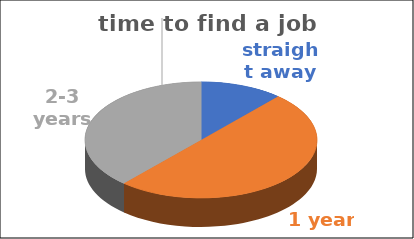
| Category | time to find a job | Series 1 | Series 2 | Series 3 | Series 4 |
|---|---|---|---|---|---|
| straight away | 0.12 |  |  |  |  |
| 1 year | 0.52 |  |  |  |  |
| 2-3 years | 0.4 |  |  |  |  |